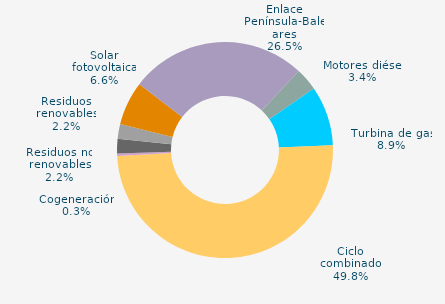
| Category | Series 0 |
|---|---|
| Carbón | 0 |
| Motores diésel | 3.424 |
| Turbina de gas | 8.929 |
| Ciclo combinado | 49.835 |
| Generación auxiliar | 0 |
| Cogeneración | 0.349 |
| Residuos no renovables | 2.19 |
| Residuos renovables | 2.19 |
| Eólica | 0.002 |
| Solar fotovoltaica | 6.564 |
| Otras renovables | 0.008 |
| Enlace Península-Baleares | 26.509 |